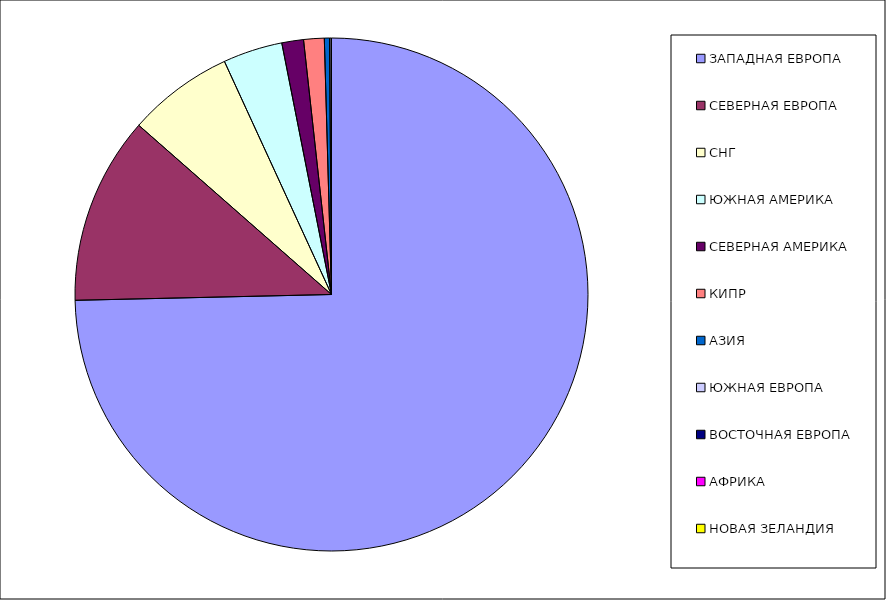
| Category | Оборот |
|---|---|
| ЗАПАДНАЯ ЕВРОПА | 0.746 |
| СЕВЕРНАЯ ЕВРОПА | 0.118 |
| СНГ | 0.067 |
| ЮЖНАЯ АМЕРИКА | 0.037 |
| СЕВЕРНАЯ АМЕРИКА | 0.014 |
| КИПР | 0.013 |
| АЗИЯ | 0.003 |
| ЮЖНАЯ ЕВРОПА | 0.001 |
| ВОСТОЧНАЯ ЕВРОПА | 0 |
| АФРИКА | 0 |
| НОВАЯ ЗЕЛАНДИЯ | 0 |